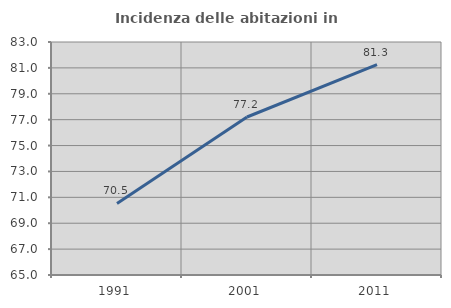
| Category | Incidenza delle abitazioni in proprietà  |
|---|---|
| 1991.0 | 70.53 |
| 2001.0 | 77.206 |
| 2011.0 | 81.257 |